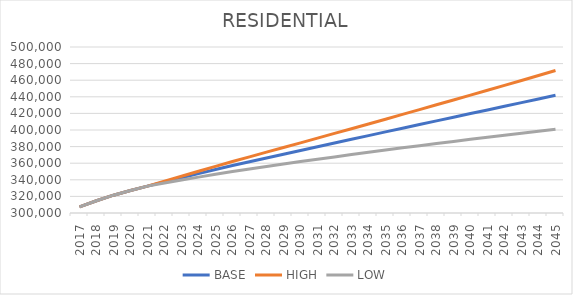
| Category | BASE | HIGH | LOW |
|---|---|---|---|
| 2017.0 | 307372.5 | 307372.5 | 307372.5 |
| 2018.0 | 314716.917 | 314716.917 | 314716.917 |
| 2019.0 | 321459.917 | 321459.917 | 321459.917 |
| 2020.0 | 327125.167 | 327125.167 | 327125.167 |
| 2021.0 | 332418.25 | 332418.25 | 332418.25 |
| 2022.0 | 337511.402 | 338354.897 | 336243.184 |
| 2023.0 | 342471.971 | 344339.509 | 339674.873 |
| 2024.0 | 347436.17 | 350265.706 | 343215.28 |
| 2025.0 | 352360.853 | 356182.906 | 346682.224 |
| 2026.0 | 357195.454 | 362039.745 | 350026.783 |
| 2027.0 | 361791.891 | 367684.789 | 353106.101 |
| 2028.0 | 366324.66 | 373294.258 | 356092.604 |
| 2029.0 | 370840.18 | 378915.116 | 359032.285 |
| 2030.0 | 375331.283 | 384539.953 | 361918.716 |
| 2031.0 | 379821.636 | 390193.541 | 364774.573 |
| 2032.0 | 384309.489 | 395874.293 | 367598.364 |
| 2033.0 | 388786.925 | 401574.209 | 370382.767 |
| 2034.0 | 393255.862 | 407295.616 | 373129.655 |
| 2035.0 | 397707.798 | 413029.692 | 375831.354 |
| 2036.0 | 402152.234 | 418786.384 | 378497.225 |
| 2037.0 | 406584.837 | 424561.399 | 381123.388 |
| 2038.0 | 411003.69 | 430352.787 | 383708.447 |
| 2039.0 | 415414.376 | 436166.646 | 386257.75 |
| 2040.0 | 419804.813 | 441989.937 | 388760.757 |
| 2041.0 | 424190.249 | 447839.272 | 391231.449 |
| 2042.0 | 428571.685 | 453716.429 | 393670.442 |
| 2043.0 | 432965.788 | 459639.277 | 396093.16 |
| 2044.0 | 437361.641 | 465596.578 | 398489.702 |
| 2045.0 | 441832.994 | 471671.661 | 400923.046 |